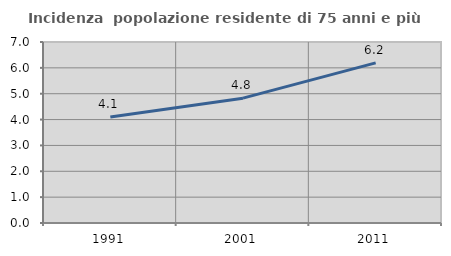
| Category | Incidenza  popolazione residente di 75 anni e più |
|---|---|
| 1991.0 | 4.098 |
| 2001.0 | 4.828 |
| 2011.0 | 6.191 |